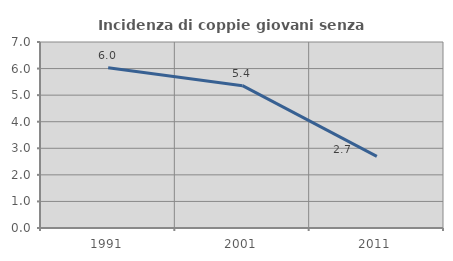
| Category | Incidenza di coppie giovani senza figli |
|---|---|
| 1991.0 | 6.029 |
| 2001.0 | 5.356 |
| 2011.0 | 2.695 |